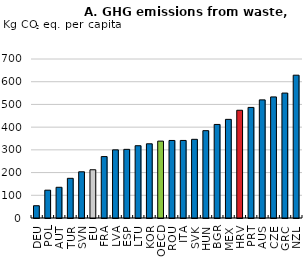
| Category | 2021 or latest |
|---|---|
| DEU | 54.018 |
| POL | 122.497 |
| AUT | 135.237 |
| TUR | 174.671 |
| SVN | 203.427 |
| EU | 212.367 |
| FRA | 270.409 |
| LVA | 300.048 |
| ESP | 302.197 |
| LTU | 318.209 |
| KOR | 326.716 |
| OECD | 338.481 |
| ROU | 341.366 |
| ITA | 341.432 |
| SVK | 346.41 |
| HUN | 384.492 |
| BGR | 411.899 |
| MEX | 434.199 |
| HRV | 474.325 |
| PRT | 486.771 |
| AUS | 520.016 |
| CZE | 533.041 |
| GRC | 549.997 |
| NZL | 628.69 |